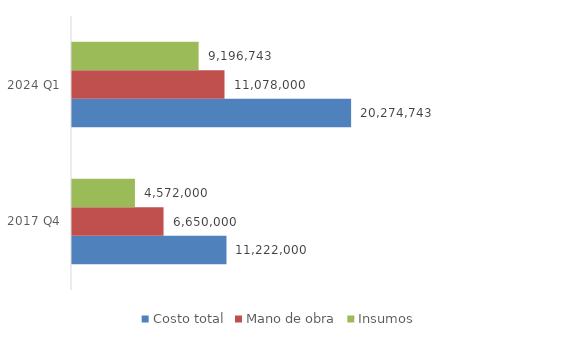
| Category | Costo total | Mano de obra | Insumos |
|---|---|---|---|
| 2017 Q4 | 11222000 | 6650000 | 4572000 |
| 2024 Q1 | 20274743.225 | 11078000 | 9196743.225 |